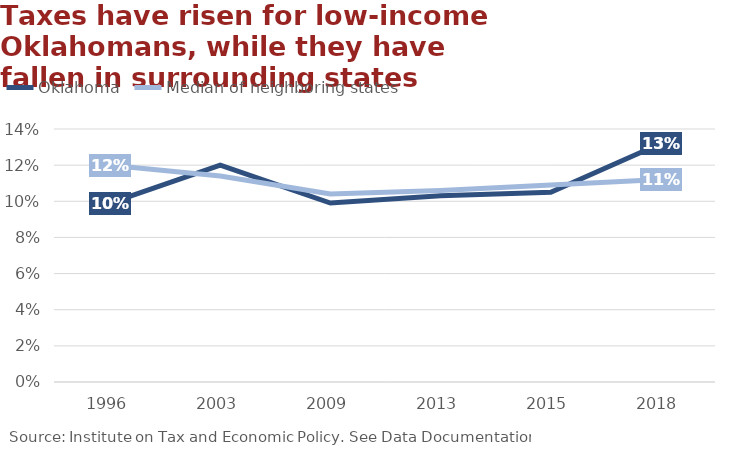
| Category | Oklahoma | Median of neighboring states |
|---|---|---|
| 1996.0 | 9.9 | 12 |
| 2003.0 | 12 | 11.4 |
| 2009.0 | 9.9 | 10.4 |
| 2013.0 | 10.3 | 10.6 |
| 2015.0 | 10.5 | 10.9 |
| 2018.0 | 13.2 | 11.2 |